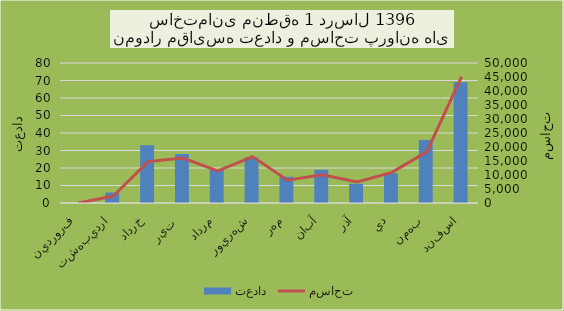
| Category | تعداد |
|---|---|
| فروردين | 0 |
| ارديبهشت | 6 |
| خرداد | 33 |
| تير  | 28 |
| مرداد | 19 |
| شهريور | 26 |
| مهر | 15 |
| آبان | 19 |
| آذر | 11 |
| دي | 17 |
| بهمن | 36 |
| اسفند | 69 |